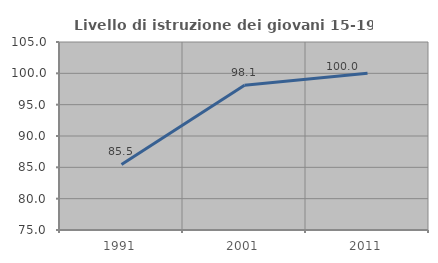
| Category | Livello di istruzione dei giovani 15-19 anni |
|---|---|
| 1991.0 | 85.455 |
| 2001.0 | 98.113 |
| 2011.0 | 100 |